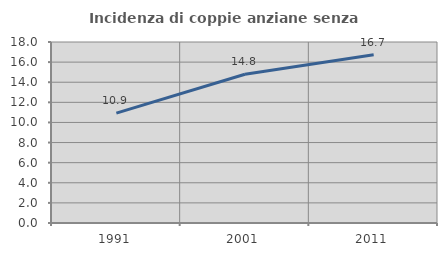
| Category | Incidenza di coppie anziane senza figli  |
|---|---|
| 1991.0 | 10.926 |
| 2001.0 | 14.792 |
| 2011.0 | 16.721 |